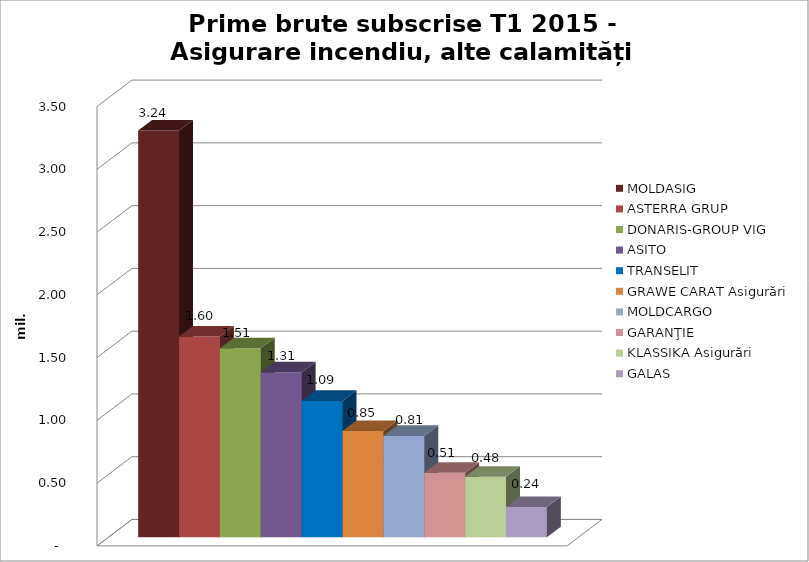
| Category | MOLDASIG  | ASTERRA GRUP  | DONARIS-GROUP VIG | ASITO  | TRANSELIT  | GRAWE CARAT Asigurări | MOLDCARGO  | GARANŢIE  | KLASSIKA Asigurări  | GALAS  |
|---|---|---|---|---|---|---|---|---|---|---|
| 0 | 3.24 | 1.599 | 1.506 | 1.314 | 1.087 | 0.846 | 0.808 | 0.514 | 0.481 | 0.241 |